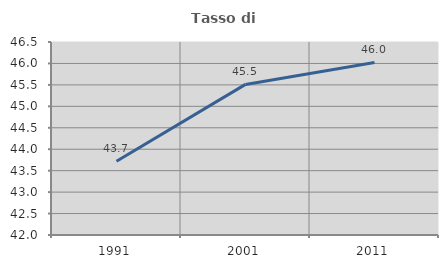
| Category | Tasso di occupazione   |
|---|---|
| 1991.0 | 43.719 |
| 2001.0 | 45.511 |
| 2011.0 | 46.022 |